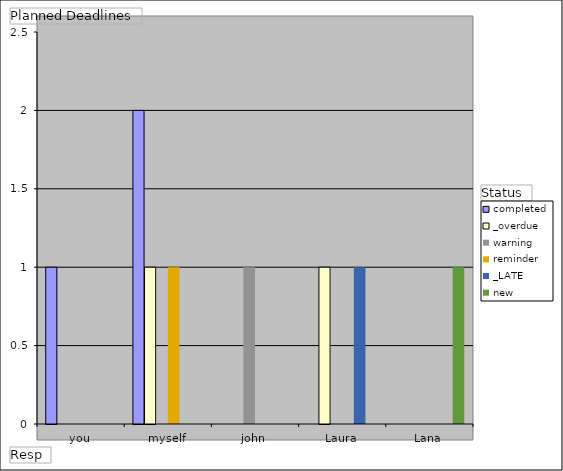
| Category | completed | _overdue | warning | reminder | _LATE | new |
|---|---|---|---|---|---|---|
| you | 1 | 0 | 0 | 0 | 0 | 0 |
| myself | 2 | 1 | 0 | 1 | 0 | 0 |
| john | 0 | 0 | 1 | 0 | 0 | 0 |
| Laura | 0 | 1 | 0 | 0 | 1 | 0 |
| Lana | 0 | 0 | 0 | 0 | 0 | 1 |